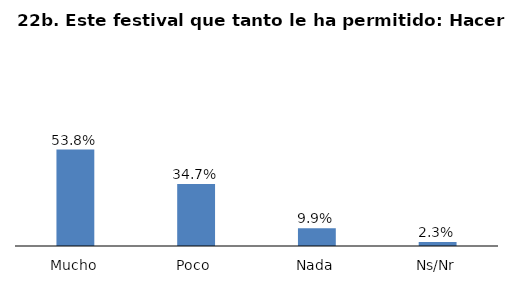
| Category | Series 0 |
|---|---|
| Mucho | 0.538 |
| Poco  | 0.347 |
| Nada | 0.099 |
| Ns/Nr | 0.023 |